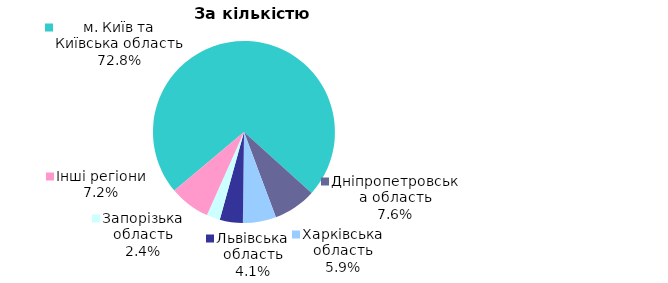
| Category | Series 0 |
|---|---|
| м. Київ та Київська область | 0.728 |
| Дніпропетровська область | 0.076 |
| Харківська область | 0.059 |
| Львівська область | 0.041 |
| Запорізька область | 0.024 |
| Інші регіони | 0.072 |